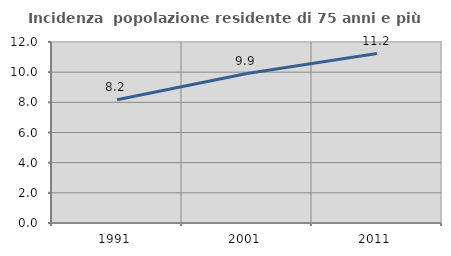
| Category | Incidenza  popolazione residente di 75 anni e più |
|---|---|
| 1991.0 | 8.176 |
| 2001.0 | 9.91 |
| 2011.0 | 11.235 |